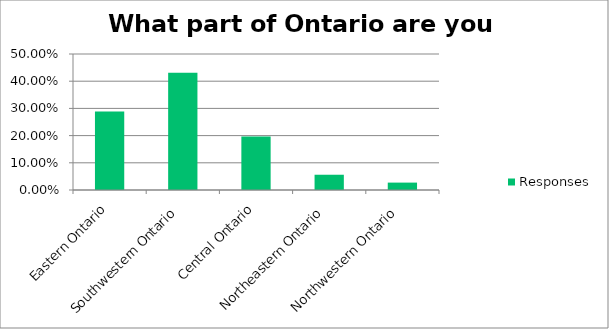
| Category | Responses |
|---|---|
| Eastern Ontario | 0.288 |
| Southwestern Ontario | 0.431 |
| Central Ontario | 0.197 |
| Northeastern Ontario | 0.056 |
| Northwestern Ontario | 0.027 |